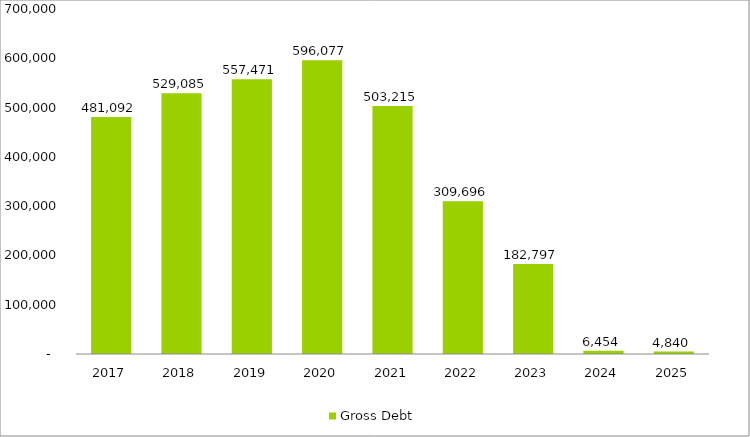
| Category | Gross Debt |
|---|---|
| 2017 | 481091.515 |
| 2018 | 529085.152 |
| 2019 | 557470.878 |
| 2020 | 596077.186 |
| 2021 | 503215.326 |
| 2022 | 309696.232 |
| 2023 | 182796.693 |
| 2024 | 6453.836 |
| 2025 | 4840.377 |